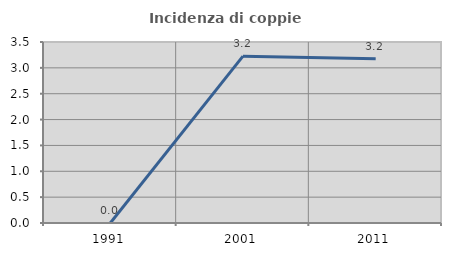
| Category | Incidenza di coppie miste |
|---|---|
| 1991.0 | 0 |
| 2001.0 | 3.226 |
| 2011.0 | 3.175 |